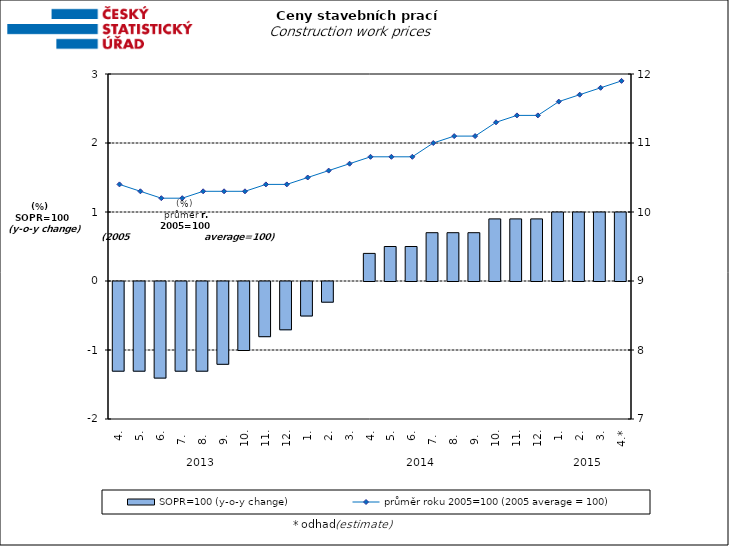
| Category | SOPR=100 (y-o-y change)   |
|---|---|
| 0 | -1.3 |
| 1 | -1.3 |
| 2 | -1.4 |
| 3 | -1.3 |
| 4 | -1.3 |
| 5 | -1.2 |
| 6 | -1 |
| 7 | -0.8 |
| 8 | -0.7 |
| 9 | -0.5 |
| 10 | -0.3 |
| 11 | 0 |
| 12 | 0.4 |
| 13 | 0.5 |
| 14 | 0.5 |
| 15 | 0.7 |
| 16 | 0.7 |
| 17 | 0.7 |
| 18 | 0.9 |
| 19 | 0.9 |
| 20 | 0.9 |
| 21 | 1 |
| 22 | 1 |
| 23 | 1 |
| 24 | 1 |